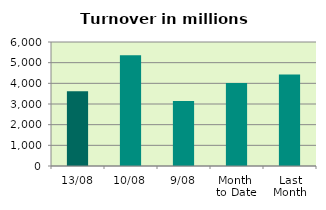
| Category | Series 0 |
|---|---|
| 13/08 | 3622.905 |
| 10/08 | 5358.53 |
| 9/08 | 3144.142 |
| Month 
to Date | 4010.512 |
| Last
Month | 4433.065 |